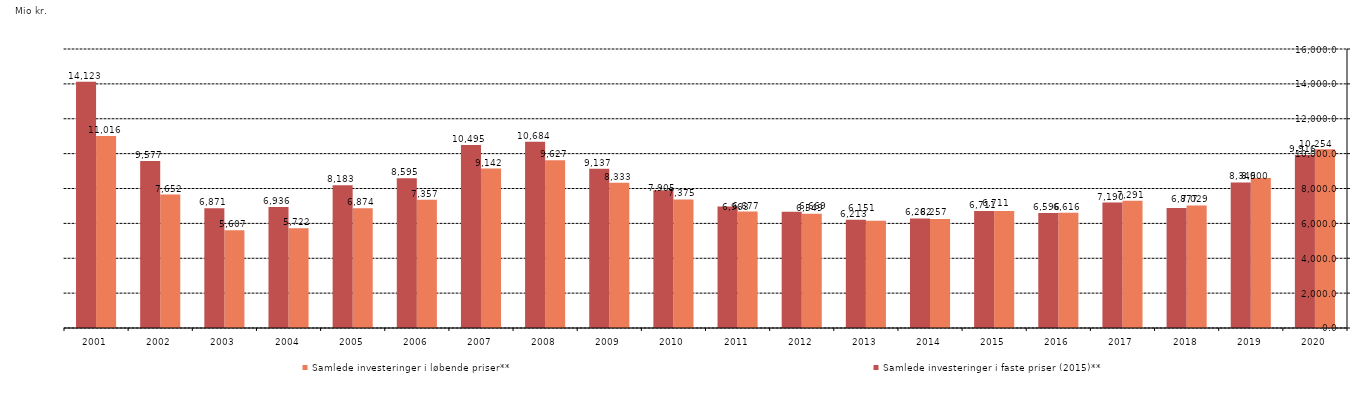
| Category | Samlede investeringer i løbende priser** | Samlede investeringer i faste priser (2015)** |
|---|---|---|
| 2020.0 | 10253.618 | 9916.458 |
| 2019.0 | 8599.529 | 8349.058 |
| 2018.0 | 7028.677 | 6877.375 |
| 2017.0 | 7290.991 | 7190.326 |
| 2016.0 | 6615.644 | 6595.857 |
| 2015.0 | 6711.477 | 6711.477 |
| 2014.0 | 6256.567 | 6281.693 |
| 2013.0 | 6150.937 | 6213.068 |
| 2012.0 | 6548.757 | 6668.795 |
| 2011.0 | 6677.383 | 6962.861 |
| 2010.0 | 7375.125 | 7904.743 |
| 2009.0 | 8332.907 | 9136.96 |
| 2008.0 | 9626.581 | 10684.329 |
| 2007.0 | 9142 | 10494.834 |
| 2006.0 | 7357 | 8594.626 |
| 2005.0 | 6874 | 8183.333 |
| 2004.0 | 5722 | 6935.758 |
| 2003.0 | 5607 | 6871.324 |
| 2002.0 | 7652 | 9576.971 |
| 2001.0 | 11016 | 14123.077 |